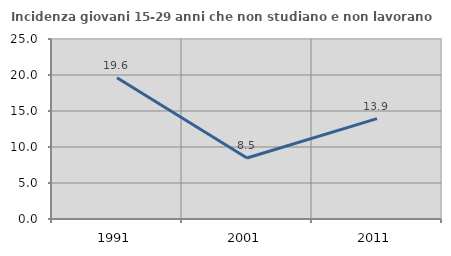
| Category | Incidenza giovani 15-29 anni che non studiano e non lavorano  |
|---|---|
| 1991.0 | 19.608 |
| 2001.0 | 8.476 |
| 2011.0 | 13.948 |